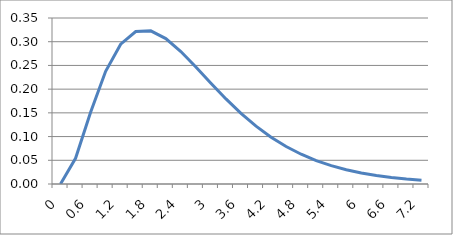
| Category | Series 0 |
|---|---|
| 0.0 | 0 |
| 0.3 | 0.054 |
| 0.6 | 0.151 |
| 0.9 | 0.238 |
| 1.2 | 0.295 |
| 1.5 | 0.321 |
| 1.8 | 0.323 |
| 2.1 | 0.307 |
| 2.4 | 0.279 |
| 2.7 | 0.247 |
| 3.0 | 0.212 |
| 3.3 | 0.179 |
| 3.6 | 0.149 |
| 3.9 | 0.122 |
| 4.2 | 0.099 |
| 4.5 | 0.079 |
| 4.8 | 0.063 |
| 5.1 | 0.049 |
| 5.4 | 0.039 |
| 5.7 | 0.03 |
| 6.0 | 0.023 |
| 6.3 | 0.018 |
| 6.6 | 0.014 |
| 6.9 | 0.01 |
| 7.2 | 0.008 |